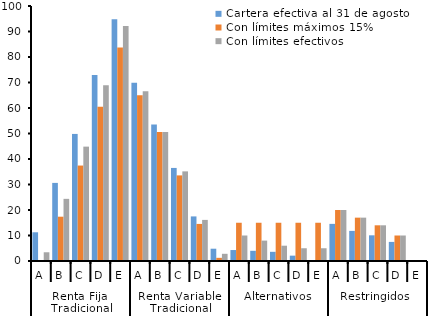
| Category | Cartera efectiva al 31 de agosto | Con límites máximos 15% | Con límites efectivos |
|---|---|---|---|
| 0 | 11.261 | 0 | 3.424 |
| 1 | 30.627 | 17.374 | 24.374 |
| 2 | 49.832 | 37.431 | 44.851 |
| 3 | 72.927 | 60.462 | 68.882 |
| 4 | 94.799 | 83.759 | 92.179 |
| 5 | 69.879 | 64.996 | 66.576 |
| 6 | 53.564 | 50.626 | 50.626 |
| 7 | 36.495 | 33.569 | 35.149 |
| 8 | 17.484 | 14.538 | 16.118 |
| 9 | 4.821 | 1.241 | 2.821 |
| 10 | 4.3 | 15 | 10 |
| 11 | 4 | 15 | 8 |
| 12 | 3.6 | 15 | 6 |
| 13 | 2.1 | 15 | 5 |
| 14 | 0 | 15 | 5 |
| 15 | 14.559 | 20 | 20 |
| 16 | 11.809 | 17 | 17 |
| 17 | 10.073 | 14 | 14 |
| 18 | 7.489 | 10 | 10 |
| 19 | 0.38 | 0 | 0 |